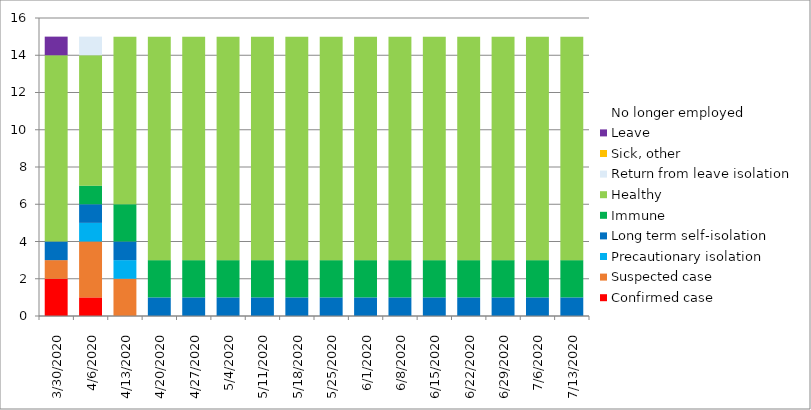
| Category | Confirmed case | Suspected case | Precautionary isolation | Long term self-isolation | Immune | Healthy | Return from leave isolation | Sick, other | Leave | No longer employed |
|---|---|---|---|---|---|---|---|---|---|---|
| 3/30/20 | 2 | 1 | 0 | 1 | 0 | 10 | 0 | 0 | 1 | 0 |
| 4/6/20 | 1 | 3 | 1 | 1 | 1 | 7 | 1 | 0 | 0 | 0 |
| 4/13/20 | 0 | 2 | 1 | 1 | 2 | 9 | 0 | 0 | 0 | 0 |
| 4/20/20 | 0 | 0 | 0 | 1 | 2 | 12 | 0 | 0 | 0 | 0 |
| 4/27/20 | 0 | 0 | 0 | 1 | 2 | 12 | 0 | 0 | 0 | 0 |
| 5/4/20 | 0 | 0 | 0 | 1 | 2 | 12 | 0 | 0 | 0 | 0 |
| 5/11/20 | 0 | 0 | 0 | 1 | 2 | 12 | 0 | 0 | 0 | 0 |
| 5/18/20 | 0 | 0 | 0 | 1 | 2 | 12 | 0 | 0 | 0 | 0 |
| 5/25/20 | 0 | 0 | 0 | 1 | 2 | 12 | 0 | 0 | 0 | 0 |
| 6/1/20 | 0 | 0 | 0 | 1 | 2 | 12 | 0 | 0 | 0 | 0 |
| 6/8/20 | 0 | 0 | 0 | 1 | 2 | 12 | 0 | 0 | 0 | 0 |
| 6/15/20 | 0 | 0 | 0 | 1 | 2 | 12 | 0 | 0 | 0 | 0 |
| 6/22/20 | 0 | 0 | 0 | 1 | 2 | 12 | 0 | 0 | 0 | 0 |
| 6/29/20 | 0 | 0 | 0 | 1 | 2 | 12 | 0 | 0 | 0 | 0 |
| 7/6/20 | 0 | 0 | 0 | 1 | 2 | 12 | 0 | 0 | 0 | 0 |
| 7/13/20 | 0 | 0 | 0 | 1 | 2 | 12 | 0 | 0 | 0 | 0 |